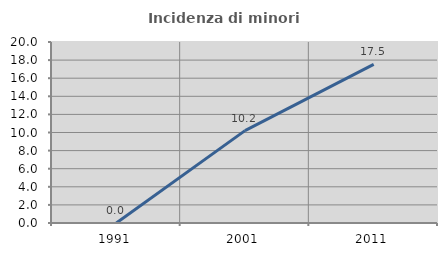
| Category | Incidenza di minori stranieri |
|---|---|
| 1991.0 | 0 |
| 2001.0 | 10.204 |
| 2011.0 | 17.536 |